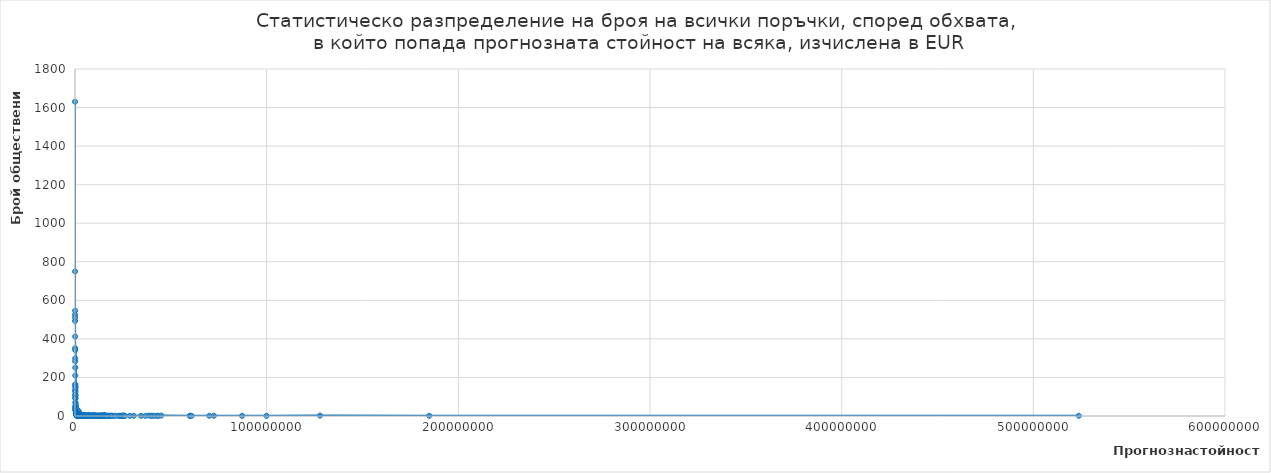
| Category | Series 0 |
|---|---|
| 10000.0 | 1630 |
| 20000.0 | 750 |
| 30000.0 | 493 |
| 40000.0 | 525 |
| 50000.0 | 546 |
| 60000.0 | 510 |
| 70000.0 | 412 |
| 80000.0 | 352 |
| 90000.0 | 299 |
| 100000.0 | 284 |
| 110000.0 | 342 |
| 120000.0 | 162 |
| 130000.0 | 251 |
| 140000.0 | 210 |
| 150000.0 | 131 |
| 160000.0 | 164 |
| 170000.0 | 135 |
| 180000.0 | 102 |
| 190000.0 | 123 |
| 200000.0 | 109 |
| 210000.0 | 148 |
| 220000.0 | 92 |
| 230000.0 | 71 |
| 240000.0 | 110 |
| 250000.0 | 92 |
| 260000.0 | 152 |
| 270000.0 | 53 |
| 280000.0 | 47 |
| 290000.0 | 43 |
| 300000.0 | 32 |
| 310000.0 | 66 |
| 320000.0 | 42 |
| 330000.0 | 34 |
| 340000.0 | 44 |
| 350000.0 | 28 |
| 360000.0 | 47 |
| 370000.0 | 36 |
| 380000.0 | 31 |
| 390000.0 | 48 |
| 400000.0 | 31 |
| 410000.0 | 56 |
| 420000.0 | 38 |
| 430000.0 | 36 |
| 440000.0 | 33 |
| 450000.0 | 29 |
| 460000.0 | 16 |
| 470000.0 | 32 |
| 480000.0 | 18 |
| 490000.0 | 28 |
| 500000.0 | 25 |
| 510000.0 | 26 |
| 520000.0 | 44 |
| 530000.0 | 23 |
| 540000.0 | 27 |
| 550000.0 | 15 |
| 560000.0 | 15 |
| 570000.0 | 33 |
| 580000.0 | 13 |
| 590000.0 | 18 |
| 600000.0 | 16 |
| 610000.0 | 8 |
| 620000.0 | 26 |
| 630000.0 | 15 |
| 640000.0 | 25 |
| 650000.0 | 9 |
| 660000.0 | 10 |
| 670000.0 | 16 |
| 680000.0 | 9 |
| 690000.0 | 12 |
| 700000.0 | 11 |
| 710000.0 | 19 |
| 720000.0 | 13 |
| 730000.0 | 13 |
| 740000.0 | 3 |
| 750000.0 | 12 |
| 760000.0 | 11 |
| 770000.0 | 38 |
| 780000.0 | 7 |
| 790000.0 | 10 |
| 800000.0 | 18 |
| 810000.0 | 4 |
| 820000.0 | 11 |
| 830000.0 | 10 |
| 840000.0 | 12 |
| 850000.0 | 10 |
| 860000.0 | 12 |
| 870000.0 | 9 |
| 880000.0 | 5 |
| 890000.0 | 11 |
| 900000.0 | 9 |
| 910000.0 | 7 |
| 920000.0 | 1 |
| 930000.0 | 14 |
| 940000.0 | 12 |
| 950000.0 | 6 |
| 960000.0 | 8 |
| 970000.0 | 8 |
| 980000.0 | 12 |
| 990000.0 | 7 |
| 1000000.0 | 9 |
| 1010000.0 | 6 |
| 1020000.0 | 3 |
| 1030000.0 | 26 |
| 1040000.0 | 12 |
| 1050000.0 | 1 |
| 1060000.0 | 4 |
| 1070000.0 | 8 |
| 1080000.0 | 10 |
| 1090000.0 | 9 |
| 1100000.0 | 2 |
| 1110000.0 | 5 |
| 1120000.0 | 4 |
| 1130000.0 | 10 |
| 1140000.0 | 7 |
| 1150000.0 | 4 |
| 1160000.0 | 8 |
| 1170000.0 | 1 |
| 1180000.0 | 4 |
| 1190000.0 | 3 |
| 1200000.0 | 7 |
| 1210000.0 | 8 |
| 1220000.0 | 4 |
| 1230000.0 | 9 |
| 1240000.0 | 2 |
| 1250000.0 | 4 |
| 1260000.0 | 3 |
| 1270000.0 | 8 |
| 1280000.0 | 15 |
| 1290000.0 | 5 |
| 1300000.0 | 2 |
| 1310000.0 | 7 |
| 1330000.0 | 7 |
| 1340000.0 | 7 |
| 1350000.0 | 2 |
| 1360000.0 | 2 |
| 1370000.0 | 1 |
| 1390000.0 | 7 |
| 1400000.0 | 3 |
| 1410000.0 | 4 |
| 1420000.0 | 2 |
| 1430000.0 | 2 |
| 1440000.0 | 6 |
| 1450000.0 | 3 |
| 1460000.0 | 2 |
| 1470000.0 | 4 |
| 1480000.0 | 3 |
| 1490000.0 | 5 |
| 1500000.0 | 5 |
| 1510000.0 | 5 |
| 1520000.0 | 1 |
| 1540000.0 | 29 |
| 1550000.0 | 1 |
| 1560000.0 | 1 |
| 1570000.0 | 1 |
| 1580000.0 | 3 |
| 1590000.0 | 5 |
| 1600000.0 | 4 |
| 1610000.0 | 1 |
| 1620000.0 | 1 |
| 1630000.0 | 6 |
| 1640000.0 | 1 |
| 1650000.0 | 4 |
| 1660000.0 | 2 |
| 1670000.0 | 3 |
| 1680000.0 | 2 |
| 1690000.0 | 2 |
| 1700000.0 | 5 |
| 1710000.0 | 2 |
| 1720000.0 | 2 |
| 1730000.0 | 2 |
| 1740000.0 | 3 |
| 1750000.0 | 1 |
| 1760000.0 | 1 |
| 1770000.0 | 3 |
| 1780000.0 | 3 |
| 1790000.0 | 1 |
| 1800000.0 | 1 |
| 1810000.0 | 4 |
| 1820000.0 | 3 |
| 1830000.0 | 1 |
| 1840000.0 | 1 |
| 1850000.0 | 8 |
| 1860000.0 | 2 |
| 1880000.0 | 3 |
| 1890000.0 | 2 |
| 1900000.0 | 3 |
| 1910000.0 | 3 |
| 1920000.0 | 5 |
| 1930000.0 | 1 |
| 1940000.0 | 2 |
| 1950000.0 | 1 |
| 1970000.0 | 3 |
| 1980000.0 | 1 |
| 1990000.0 | 1 |
| 2000000.0 | 1 |
| 2010000.0 | 1 |
| 2020000.0 | 1 |
| 2030000.0 | 3 |
| 2040000.0 | 4 |
| 2050000.0 | 23 |
| 2060000.0 | 2 |
| 2070000.0 | 3 |
| 2080000.0 | 3 |
| 2090000.0 | 1 |
| 2100000.0 | 3 |
| 2110000.0 | 1 |
| 2120000.0 | 1 |
| 2130000.0 | 1 |
| 2140000.0 | 3 |
| 2150000.0 | 1 |
| 2160000.0 | 1 |
| 2170000.0 | 1 |
| 2180000.0 | 3 |
| 2190000.0 | 2 |
| 2200000.0 | 4 |
| 2210000.0 | 2 |
| 2220000.0 | 1 |
| 2240000.0 | 1 |
| 2250000.0 | 3 |
| 2260000.0 | 3 |
| 2280000.0 | 2 |
| 2290000.0 | 1 |
| 2300000.0 | 3 |
| 2310000.0 | 9 |
| 2320000.0 | 3 |
| 2330000.0 | 2 |
| 2340000.0 | 3 |
| 2360000.0 | 2 |
| 2370000.0 | 1 |
| 2380000.0 | 2 |
| 2390000.0 | 3 |
| 2400000.0 | 1 |
| 2410000.0 | 1 |
| 2420000.0 | 2 |
| 2430000.0 | 3 |
| 2450000.0 | 1 |
| 2460000.0 | 1 |
| 2470000.0 | 3 |
| 2490000.0 | 1 |
| 2500000.0 | 6 |
| 2510000.0 | 1 |
| 2540000.0 | 4 |
| 2560000.0 | 12 |
| 2570000.0 | 1 |
| 2580000.0 | 2 |
| 2590000.0 | 4 |
| 2600000.0 | 3 |
| 2610000.0 | 1 |
| 2620000.0 | 1 |
| 2660000.0 | 6 |
| 2670000.0 | 3 |
| 2690000.0 | 1 |
| 2700000.0 | 1 |
| 2710000.0 | 1 |
| 2750000.0 | 1 |
| 2770000.0 | 2 |
| 2790000.0 | 1 |
| 2820000.0 | 3 |
| 2830000.0 | 2 |
| 2840000.0 | 1 |
| 2850000.0 | 1 |
| 2860000.0 | 1 |
| 2870000.0 | 1 |
| 2900000.0 | 1 |
| 2910000.0 | 3 |
| 2920000.0 | 2 |
| 2930000.0 | 2 |
| 2960000.0 | 1 |
| 2970000.0 | 2 |
| 2980000.0 | 1 |
| 2990000.0 | 1 |
| 3010000.0 | 1 |
| 3020000.0 | 3 |
| 3070000.0 | 8 |
| 3080000.0 | 3 |
| 3110000.0 | 1 |
| 3140000.0 | 2 |
| 3150000.0 | 1 |
| 3160000.0 | 1 |
| 3170000.0 | 1 |
| 3180000.0 | 3 |
| 3210000.0 | 1 |
| 3220000.0 | 2 |
| 3230000.0 | 1 |
| 3240000.0 | 2 |
| 3250000.0 | 1 |
| 3260000.0 | 1 |
| 3280000.0 | 1 |
| 3290000.0 | 1 |
| 3300000.0 | 1 |
| 3320000.0 | 1 |
| 3330000.0 | 4 |
| 3380000.0 | 1 |
| 3390000.0 | 3 |
| 3400000.0 | 2 |
| 3410000.0 | 1 |
| 3420000.0 | 1 |
| 3440000.0 | 1 |
| 3470000.0 | 1 |
| 3480000.0 | 2 |
| 3490000.0 | 1 |
| 3510000.0 | 1 |
| 3520000.0 | 1 |
| 3530000.0 | 2 |
| 3560000.0 | 1 |
| 3570000.0 | 1 |
| 3580000.0 | 3 |
| 3600000.0 | 2 |
| 3640000.0 | 1 |
| 3690000.0 | 4 |
| 3720000.0 | 1 |
| 3740000.0 | 1 |
| 3760000.0 | 2 |
| 3800000.0 | 1 |
| 3820000.0 | 1 |
| 3840000.0 | 2 |
| 3860000.0 | 1 |
| 3870000.0 | 2 |
| 3900000.0 | 3 |
| 3910000.0 | 1 |
| 3920000.0 | 1 |
| 3950000.0 | 2 |
| 3960000.0 | 1 |
| 3980000.0 | 1 |
| 4000000.0 | 1 |
| 4040000.0 | 1 |
| 4060000.0 | 2 |
| 4090000.0 | 1 |
| 4100000.0 | 3 |
| 4120000.0 | 1 |
| 4130000.0 | 1 |
| 4140000.0 | 1 |
| 4160000.0 | 1 |
| 4170000.0 | 1 |
| 4180000.0 | 1 |
| 4200000.0 | 1 |
| 4210000.0 | 1 |
| 4220000.0 | 1 |
| 4230000.0 | 1 |
| 4270000.0 | 1 |
| 4280000.0 | 3 |
| 4320000.0 | 2 |
| 4330000.0 | 1 |
| 4350000.0 | 1 |
| 4370000.0 | 1 |
| 4390000.0 | 1 |
| 4410000.0 | 1 |
| 4480000.0 | 1 |
| 4490000.0 | 1 |
| 4500000.0 | 1 |
| 4510000.0 | 1 |
| 4610000.0 | 3 |
| 4640000.0 | 1 |
| 4650000.0 | 1 |
| 4660000.0 | 2 |
| 4670000.0 | 1 |
| 4680000.0 | 1 |
| 4690000.0 | 2 |
| 4700000.0 | 1 |
| 4740000.0 | 1 |
| 4760000.0 | 1 |
| 4820000.0 | 2 |
| 4850000.0 | 1 |
| 4860000.0 | 1 |
| 4890000.0 | 1 |
| 4930000.0 | 1 |
| 4950000.0 | 1 |
| 4960000.0 | 1 |
| 4990000.0 | 1 |
| 5010000.0 | 1 |
| 5050000.0 | 1 |
| 5120000.0 | 5 |
| 5250000.0 | 1 |
| 5320000.0 | 1 |
| 5370000.0 | 3 |
| 5450000.0 | 2 |
| 5490000.0 | 1 |
| 5530000.0 | 1 |
| 5670000.0 | 1 |
| 5700000.0 | 1 |
| 5730000.0 | 1 |
| 5740000.0 | 1 |
| 5760000.0 | 1 |
| 5790000.0 | 1 |
| 5970000.0 | 1 |
| 5990000.0 | 1 |
| 6040000.0 | 1 |
| 6140000.0 | 1 |
| 6240000.0 | 1 |
| 6400000.0 | 2 |
| 6410000.0 | 1 |
| 6620000.0 | 1 |
| 6650000.0 | 2 |
| 6660000.0 | 1 |
| 6740000.0 | 1 |
| 6760000.0 | 1 |
| 6790000.0 | 1 |
| 6910000.0 | 1 |
| 6960000.0 | 2 |
| 6970000.0 | 1 |
| 6980000.0 | 1 |
| 7070000.0 | 1 |
| 7160000.0 | 1 |
| 7230000.0 | 1 |
| 7300000.0 | 1 |
| 7370000.0 | 1 |
| 7410000.0 | 1 |
| 7550000.0 | 2 |
| 7560000.0 | 1 |
| 7570000.0 | 1 |
| 7590000.0 | 1 |
| 7620000.0 | 1 |
| 7670000.0 | 4 |
| 7680000.0 | 1 |
| 7740000.0 | 1 |
| 7780000.0 | 1 |
| 7940000.0 | 1 |
| 8160000.0 | 1 |
| 8200000.0 | 1 |
| 8210000.0 | 1 |
| 8460000.0 | 1 |
| 8670000.0 | 1 |
| 8780000.0 | 1 |
| 8910000.0 | 1 |
| 9050000.0 | 1 |
| 9110000.0 | 1 |
| 9120000.0 | 1 |
| 9130000.0 | 1 |
| 9170000.0 | 2 |
| 9210000.0 | 2 |
| 9240000.0 | 1 |
| 9320000.0 | 1 |
| 9370000.0 | 1 |
| 9460000.0 | 1 |
| 9470000.0 | 1 |
| 9480000.0 | 1 |
| 9540000.0 | 1 |
| 9720000.0 | 1 |
| 9790000.0 | 1 |
| 9830000.0 | 2 |
| 9910000.0 | 1 |
| 10230000.0 | 1 |
| 10280000.0 | 2 |
| 10310000.0 | 2 |
| 10340000.0 | 1 |
| 10490000.0 | 1 |
| 10540000.0 | 1 |
| 10770000.0 | 1 |
| 10810000.0 | 1 |
| 11220000.0 | 2 |
| 11400000.0 | 1 |
| 11560000.0 | 1 |
| 11640000.0 | 1 |
| 11650000.0 | 1 |
| 12170000.0 | 1 |
| 12290000.0 | 2 |
| 12390000.0 | 1 |
| 12790000.0 | 1 |
| 13210000.0 | 1 |
| 13280000.0 | 1 |
| 13300000.0 | 1 |
| 13320000.0 | 1 |
| 13480000.0 | 1 |
| 13540000.0 | 1 |
| 13570000.0 | 1 |
| 13690000.0 | 1 |
| 13760000.0 | 2 |
| 13800000.0 | 1 |
| 14240000.0 | 1 |
| 14310000.0 | 1 |
| 14320000.0 | 1 |
| 14350000.0 | 1 |
| 14380000.0 | 1 |
| 14650000.0 | 1 |
| 14710000.0 | 1 |
| 14770000.0 | 1 |
| 14950000.0 | 1 |
| 15050000.0 | 1 |
| 15060000.0 | 1 |
| 15320000.0 | 1 |
| 15340000.0 | 6 |
| 15390000.0 | 1 |
| 15410000.0 | 1 |
| 16010000.0 | 1 |
| 16020000.0 | 1 |
| 16390000.0 | 1 |
| 16990000.0 | 1 |
| 17490000.0 | 1 |
| 17790000.0 | 2 |
| 18760000.0 | 1 |
| 18880000.0 | 1 |
| 19180000.0 | 1 |
| 19470000.0 | 1 |
| 20680000.0 | 1 |
| 21150000.0 | 1 |
| 22690000.0 | 1 |
| 23420000.0 | 1 |
| 24100000.0 | 1 |
| 24430000.0 | 1 |
| 24550000.0 | 1 |
| 24730000.0 | 1 |
| 25400000.0 | 1 |
| 25570000.0 | 1 |
| 25630000.0 | 1 |
| 25640000.0 | 1 |
| 25770000.0 | 1 |
| 26050000.0 | 1 |
| 28640000.0 | 1 |
| 30680000.0 | 1 |
| 34450000.0 | 1 |
| 36760000.0 | 1 |
| 38490000.0 | 2 |
| 39840000.0 | 1 |
| 40260000.0 | 1 |
| 41570000.0 | 1 |
| 43030000.0 | 1 |
| 43460000.0 | 1 |
| 45000000.0 | 2 |
| 59830000.0 | 1 |
| 60010000.0 | 1 |
| 60850000.0 | 1 |
| 70050000.0 | 1 |
| 72440000.0 | 1 |
| 87180000.0 | 1 |
| 99920000.0 | 1 |
| 127830000.0 | 2 |
| 184830000.0 | 1 |
| 523740000.0 | 1 |